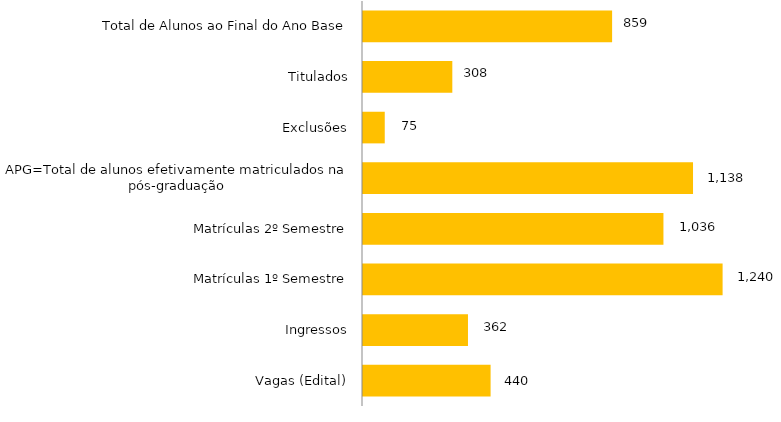
| Category | Curso |
|---|---|
| Vagas (Edital) | 440 |
| Ingressos | 362 |
| Matrículas 1º Semestre | 1240 |
| Matrículas 2º Semestre | 1036 |
| APG=Total de alunos efetivamente matriculados na pós-graduação | 1138 |
| Exclusões | 75 |
| Titulados | 308 |
| Total de Alunos ao Final do Ano Base | 859 |